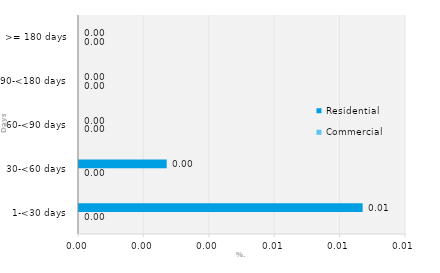
| Category | Commercial | Residential |
|---|---|---|
| 1-<30 days | 0 | 0.009 |
| 30-<60 days | 0 | 0.003 |
| 60-<90 days | 0 | 0 |
| 90-<180 days | 0 | 0 |
| >= 180 days | 0 | 0 |